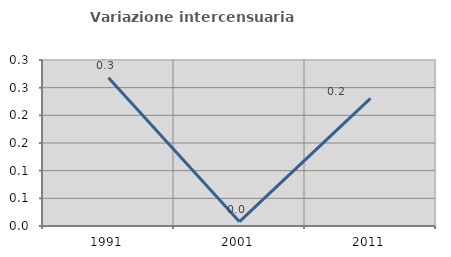
| Category | Variazione intercensuaria annua |
|---|---|
| 1991.0 | 0.268 |
| 2001.0 | 0.008 |
| 2011.0 | 0.231 |